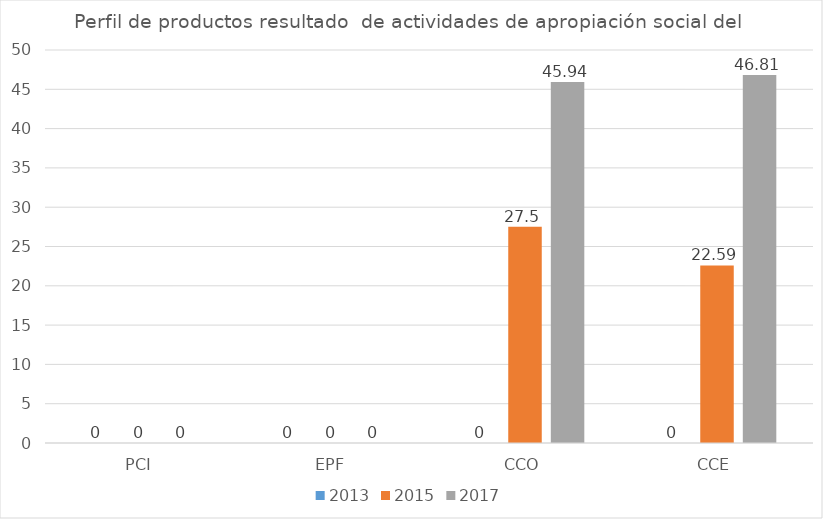
| Category | 2013 | 2015 | 2017 |
|---|---|---|---|
| PCI | 0 | 0 | 0 |
| EPF | 0 | 0 | 0 |
| CCO | 0 | 27.5 | 45.94 |
| CCE | 0 | 22.59 | 46.81 |